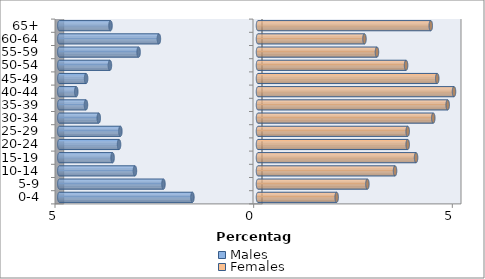
| Category | Males | Females |
|---|---|---|
| 0-4 | -1.651 | 1.98 |
| 5-9 | -2.38 | 2.753 |
| 10-14 | -3.098 | 3.449 |
| 15-19 | -3.66 | 3.978 |
| 20-24 | -3.497 | 3.767 |
| 25-29 | -3.464 | 3.767 |
| 30-34 | -4.008 | 4.411 |
| 35-39 | -4.33 | 4.774 |
| 40-44 | -4.574 | 4.933 |
| 45-49 | -4.326 | 4.511 |
| 50-54 | -3.727 | 3.727 |
| 55-59 | -3.005 | 2.994 |
| 60-64 | -2.494 | 2.679 |
| 65+ | -3.712 | 4.348 |